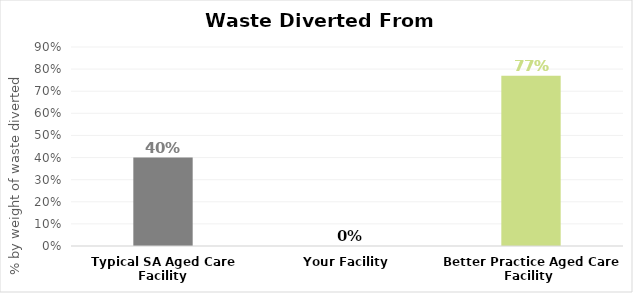
| Category | $ per year |
|---|---|
| Reuse | 0 |
| Recycle | 0 |
| Recover for energy | 0 |
| Treat/Dispose | 0 |